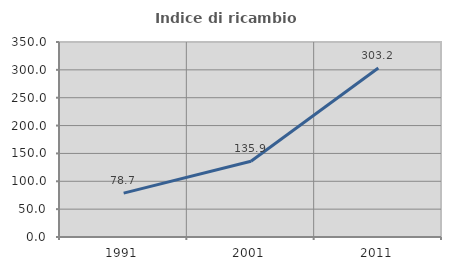
| Category | Indice di ricambio occupazionale  |
|---|---|
| 1991.0 | 78.694 |
| 2001.0 | 135.897 |
| 2011.0 | 303.191 |